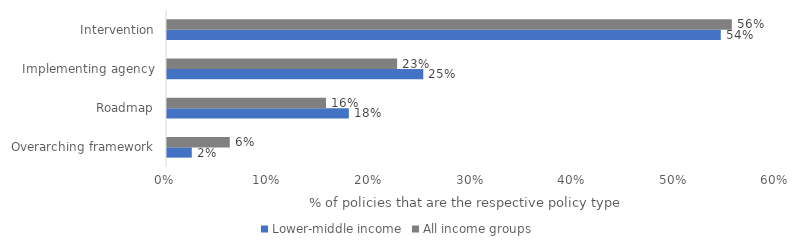
| Category | Lower-middle income | All income groups |
|---|---|---|
| Overarching framework | 0.024 | 0.062 |
| Roadmap | 0.179 | 0.156 |
| Implementing agency | 0.252 | 0.226 |
| Intervention | 0.545 | 0.556 |